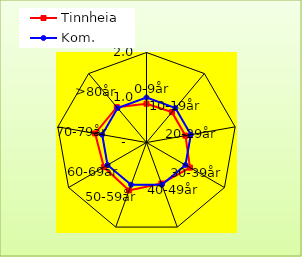
| Category | Tinnheia | Kom. |
|---|---|---|
| 0-9år | 0.862 | 1 |
| 10-19år | 0.88 | 1 |
| 20-29år | 0.879 | 1 |
| 30-39år | 1.116 | 1 |
| 40-49år | 0.969 | 1 |
| 50-59år | 1.134 | 1 |
| 60-69år | 1.093 | 1 |
| 70-79år | 1.159 | 1 |
| >80år | 1.025 | 1 |